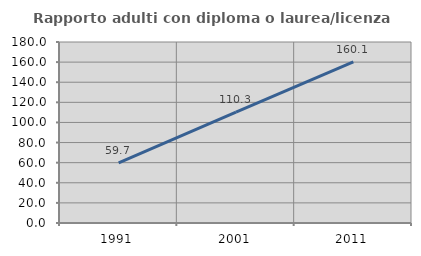
| Category | Rapporto adulti con diploma o laurea/licenza media  |
|---|---|
| 1991.0 | 59.734 |
| 2001.0 | 110.251 |
| 2011.0 | 160.13 |